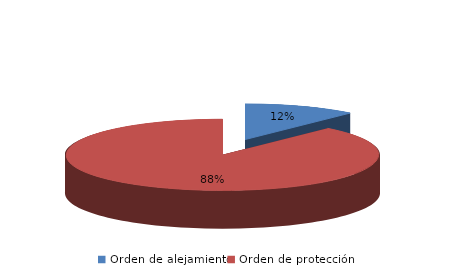
| Category | Series 0 |
|---|---|
| Orden de alejamiento | 10 |
| Orden de protección | 76 |